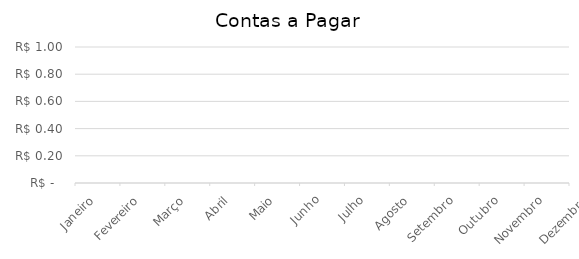
| Category | Contas a Pagar |
|---|---|
| Janeiro | 0 |
| Fevereiro | 0 |
| Março | 0 |
| Abril | 0 |
| Maio | 0 |
| Junho | 0 |
| Julho | 0 |
| Agosto | 0 |
| Setembro | 0 |
| Outubro | 0 |
| Novembro | 0 |
| Dezembro | 0 |